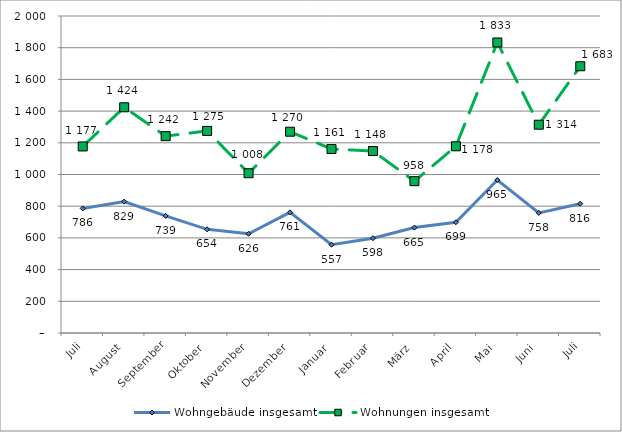
| Category | Wohngebäude insgesamt | Wohnungen insgesamt |
|---|---|---|
| Juli | 786 | 1177 |
| August | 829 | 1424 |
| September | 739 | 1242 |
| Oktober | 654 | 1275 |
| November | 626 | 1008 |
| Dezember | 761 | 1270 |
| Januar | 557 | 1161 |
| Februar | 598 | 1148 |
| März | 665 | 958 |
| April | 699 | 1178 |
| Mai | 965 | 1833 |
| Juni | 758 | 1314 |
| Juli | 816 | 1683 |